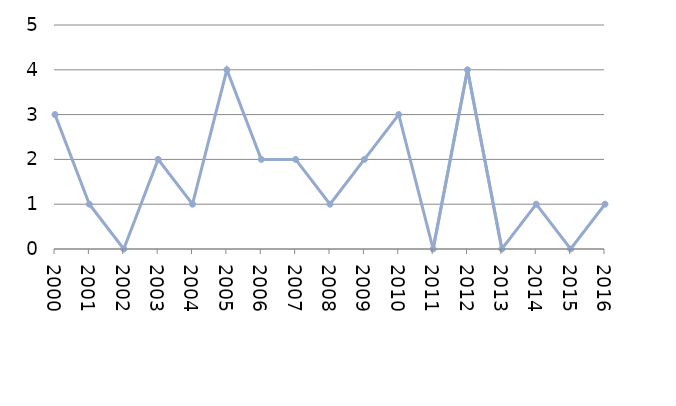
| Category | Avlidna |
|---|---|
| 2000 | 3 |
| 2001 | 1 |
| 2002 | 0 |
| 2003 | 2 |
| 2004 | 1 |
| 2005 | 4 |
| 2006 | 2 |
| 2007 | 2 |
| 2008 | 1 |
| 2009 | 2 |
| 2010 | 3 |
| 2011 | 0 |
| 2012 | 4 |
| 2013 | 0 |
| 2014 | 1 |
| 2015 | 0 |
| 2016 | 1 |